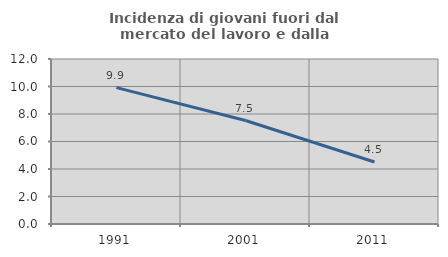
| Category | Incidenza di giovani fuori dal mercato del lavoro e dalla formazione  |
|---|---|
| 1991.0 | 9.917 |
| 2001.0 | 7.527 |
| 2011.0 | 4.511 |